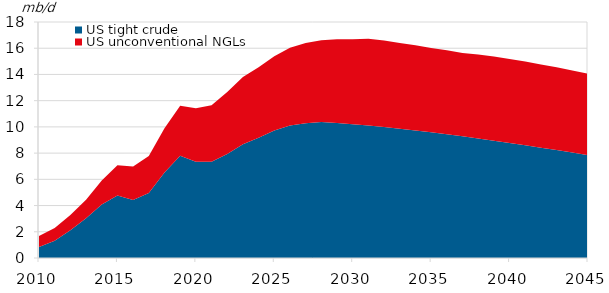
| Category | US tight crude | US unconventional NGLs |
|---|---|---|
| 2010.0 | 0.84 | 0.847 |
| 2011.0 | 1.307 | 0.984 |
| 2012.0 | 2.125 | 1.146 |
| 2013.0 | 3.023 | 1.417 |
| 2014.0 | 4.088 | 1.823 |
| 2015.0 | 4.776 | 2.305 |
| 2016.0 | 4.426 | 2.546 |
| 2017.0 | 4.966 | 2.818 |
| 2018.0 | 6.523 | 3.366 |
| 2019.0 | 7.79 | 3.816 |
| 2020.0 | 7.344 | 4.075 |
| 2021.0 | 7.344 | 4.306 |
| 2022.0 | 7.93 | 4.74 |
| 2023.0 | 8.68 | 5.13 |
| 2024.0 | 9.18 | 5.37 |
| 2025.0 | 9.728 | 5.668 |
| 2026.0 | 10.115 | 5.912 |
| 2027.0 | 10.285 | 6.104 |
| 2028.0 | 10.38 | 6.229 |
| 2029.0 | 10.305 | 6.378 |
| 2030.0 | 10.207 | 6.474 |
| 2031.0 | 10.099 | 6.619 |
| 2032.0 | 9.983 | 6.6 |
| 2033.0 | 9.858 | 6.534 |
| 2034.0 | 9.724 | 6.498 |
| 2035.0 | 9.584 | 6.437 |
| 2036.0 | 9.435 | 6.415 |
| 2037.0 | 9.28 | 6.363 |
| 2038.0 | 9.119 | 6.407 |
| 2039.0 | 8.951 | 6.42 |
| 2040.0 | 8.779 | 6.393 |
| 2041.0 | 8.601 | 6.383 |
| 2042.0 | 8.418 | 6.338 |
| 2043.0 | 8.232 | 6.315 |
| 2044.0 | 8.042 | 6.261 |
| 2045.0 | 7.85 | 6.201 |